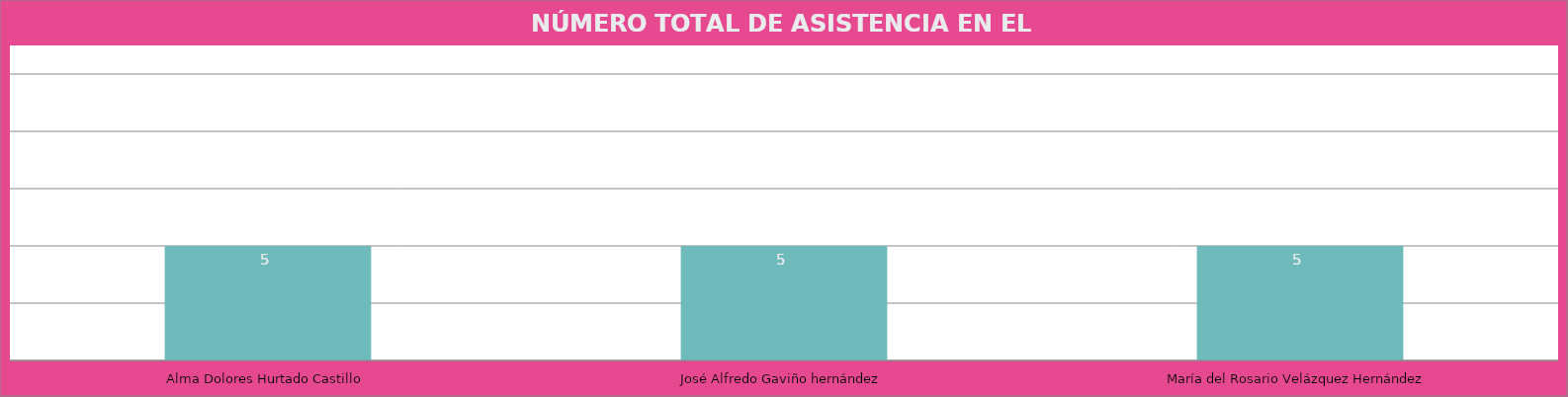
| Category | Alma Dolores Hurtado Castillo |
|---|---|
| Alma Dolores Hurtado Castillo | 5 |
| José Alfredo Gaviño hernández | 5 |
| María del Rosario Velázquez Hernández | 5 |